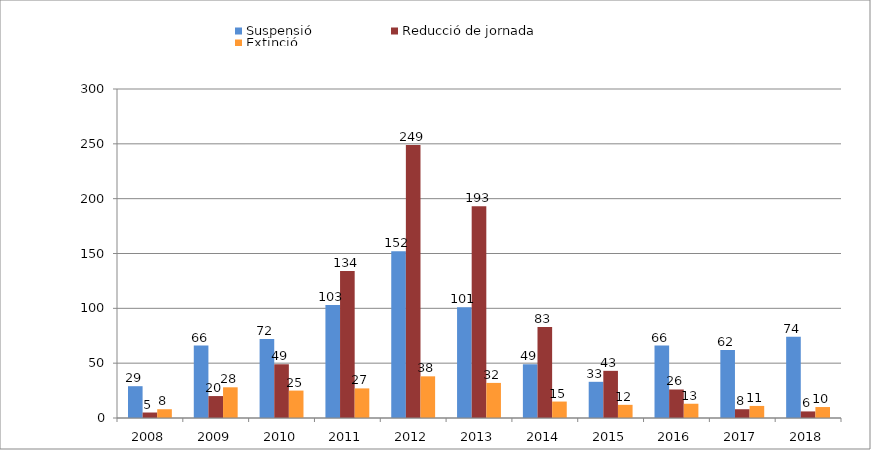
| Category | Suspensió | Reducció de jornada | Extinció |
|---|---|---|---|
| 2008.0 | 29 | 5 | 8 |
| 2009.0 | 66 | 20 | 28 |
| 2010.0 | 72 | 49 | 25 |
| 2011.0 | 103 | 134 | 27 |
| 2012.0 | 152 | 249 | 38 |
| 2013.0 | 101 | 193 | 32 |
| 2014.0 | 49 | 83 | 15 |
| 2015.0 | 33 | 43 | 12 |
| 2016.0 | 66 | 26 | 13 |
| 2017.0 | 62 | 8 | 11 |
| 2018.0 | 74 | 6 | 10 |